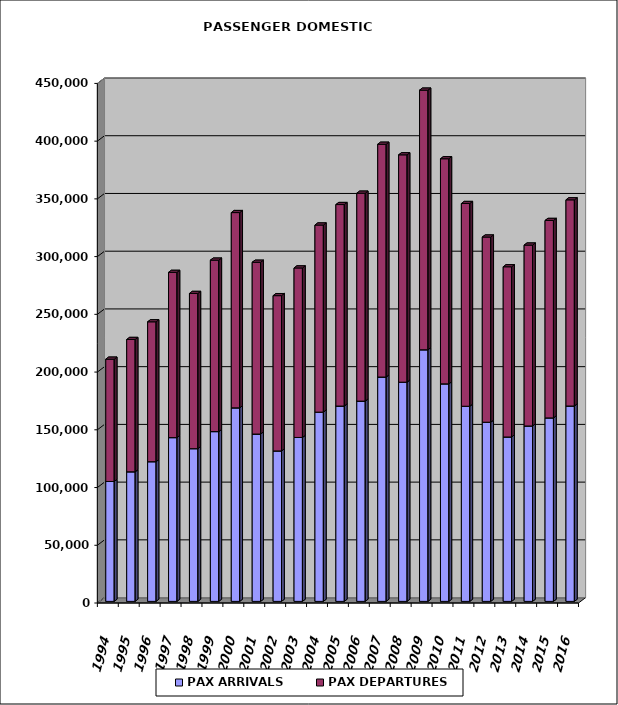
| Category | PAX ARRIVALS | PAX DEPARTURES |
|---|---|---|
| 1994.0 | 103837 | 105909 |
| 1995.0 | 112233 | 114583 |
| 1996.0 | 120971 | 121153 |
| 1997.0 | 141824 | 143102 |
| 1998.0 | 132259 | 134424 |
| 1999.0 | 147036 | 148488 |
| 2000.0 | 167611 | 169112 |
| 2001.0 | 144925 | 148763 |
| 2002.0 | 130292 | 134484 |
| 2003.0 | 141963 | 146797 |
| 2004.0 | 163896 | 162042 |
| 2005.0 | 169165 | 174511 |
| 2006.0 | 173442 | 180071 |
| 2007.0 | 194289 | 201597 |
| 2008.0 | 189840 | 196901 |
| 2009.0 | 217913 | 224830 |
| 2010.0 | 188384 | 194957 |
| 2011.0 | 169003 | 175577 |
| 2012.0 | 155168 | 160356 |
| 2013.0 | 142388 | 147404 |
| 2014.0 | 151913 | 156665 |
| 2015.0 | 158903 | 170995 |
| 2016.0 | 169204 | 178555 |